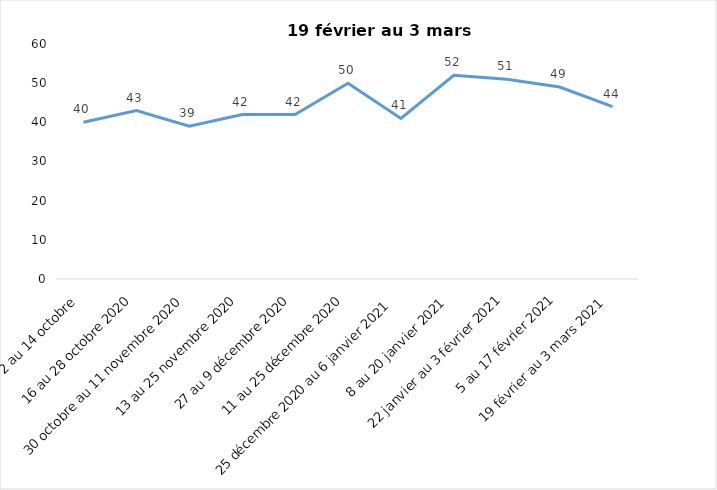
| Category | Toujours aux trois mesures |
|---|---|
| 2 au 14 octobre  | 40 |
| 16 au 28 octobre 2020 | 43 |
| 30 octobre au 11 novembre 2020 | 39 |
| 13 au 25 novembre 2020 | 42 |
| 27 au 9 décembre 2020 | 42 |
| 11 au 25 décembre 2020 | 50 |
| 25 décembre 2020 au 6 janvier 2021 | 41 |
| 8 au 20 janvier 2021 | 52 |
| 22 janvier au 3 février 2021 | 51 |
| 5 au 17 février 2021 | 49 |
| 19 février au 3 mars 2021 | 44 |